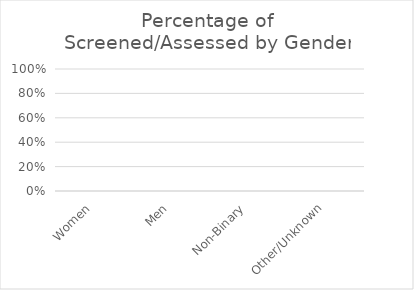
| Category | % of screened |
|---|---|
| Women | 0 |
| Men | 0 |
| Non-Binary | 0 |
| Other/Unknown | 0 |